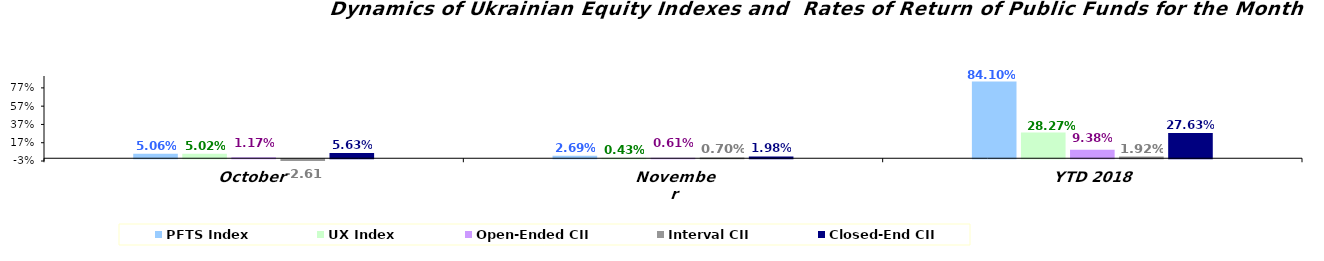
| Category | PFTS Index | UX Index | Open-Ended CII | Interval CII | Closed-End CII |
|---|---|---|---|---|---|
| October | 0.051 | 0.05 | 0.012 | -0.026 | 0.056 |
| November | 0.027 | 0.004 | 0.006 | 0.007 | 0.02 |
| YTD 2018 | 0.841 | 0.283 | 0.094 | 0.019 | 0.276 |